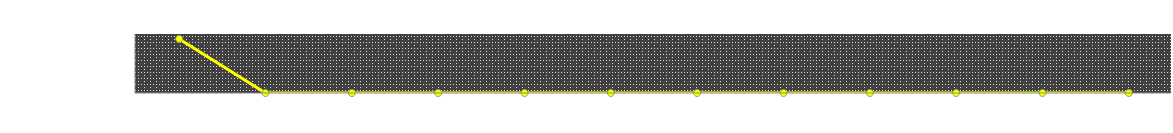
| Category | Zůstatek |
|---|---|
| LEDEN | 5500 |
| ÚNOR | 0 |
| BŘEZEN | 0 |
| DUBEN | 0 |
| KVĚTEN | 0 |
| ČERVEN | 0 |
| ČERVENEC | 0 |
| SRPEN | 0 |
| ZÁŘÍ | 0 |
| ŘÍJEN | 0 |
| LISTOPAD | 0 |
| PROSINEC | 0 |